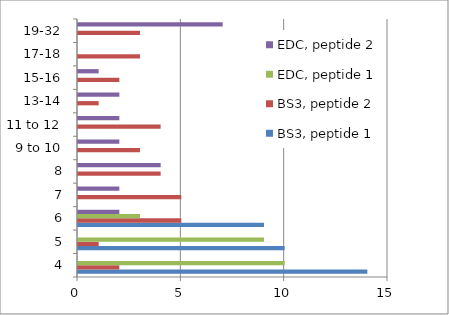
| Category | BS3, peptide 1 | BS3, peptide 2 | EDC, peptide 1 | EDC, peptide 2 |
|---|---|---|---|---|
| 4 | 14 | 2 | 10 | 0 |
| 5 | 10 | 1 | 9 | 0 |
| 6 | 9 | 5 | 3 | 2 |
| 7 | 0 | 5 | 0 | 2 |
| 8 | 0 | 4 | 0 | 4 |
| 9 to 10 | 0 | 3 | 0 | 2 |
| 11 to 12 | 0 | 4 | 0 | 2 |
| 13-14 | 0 | 1 | 0 | 2 |
| 15-16 | 0 | 2 | 0 | 1 |
| 17-18 | 0 | 3 | 0 | 0 |
| 19-32 | 0 | 3 | 0 | 7 |